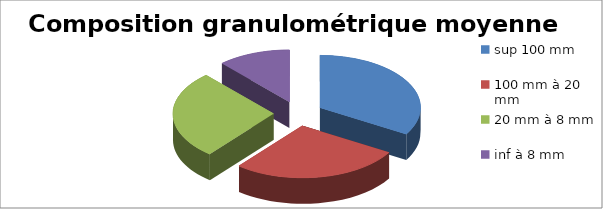
| Category | Moyenne |
|---|---|
| sup 100 mm | 0.335 |
| 100 mm à 20 mm | 0.274 |
| 20 mm à 8 mm | 0.274 |
| inf à 8 mm | 0.117 |